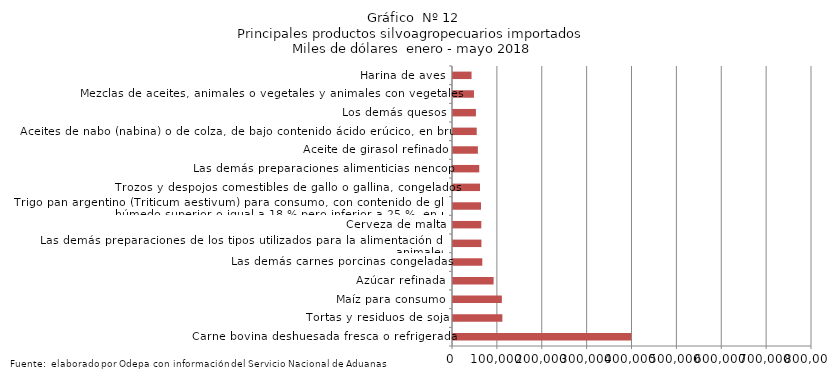
| Category | Series 0 |
|---|---|
| Carne bovina deshuesada fresca o refrigerada | 397172.465 |
| Tortas y residuos de soja | 110000.556 |
| Maíz para consumo | 108834.961 |
| Azúcar refinada | 90472.553 |
| Las demás carnes porcinas congeladas | 65291.571 |
| Las demás preparaciones de los tipos utilizados para la alimentación de los animales | 63377.516 |
| Cerveza de malta | 63045.742 |
| Trigo pan argentino (Triticum aestivum) para consumo, con contenido de gluten húmedo superior o igual a 18 % pero inferior a 25 %, en peso | 62378.912 |
| Trozos y despojos comestibles de gallo o gallina, congelados | 60203.663 |
| Las demás preparaciones alimenticias nencop | 58493.778 |
| Aceite de girasol refinado | 55453.373 |
| Aceites de nabo (nabina) o de colza, de bajo contenido ácido erúcico, en bruto | 52864.512 |
| Los demás quesos | 51070.441 |
| Mezclas de aceites, animales o vegetales y animales con vegetales | 46716.782 |
| Harina de aves | 41321.987 |